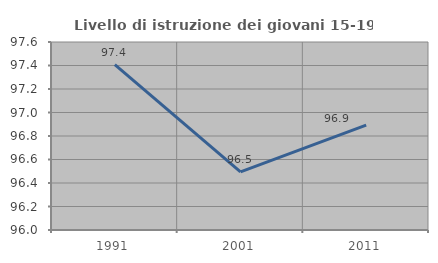
| Category | Livello di istruzione dei giovani 15-19 anni |
|---|---|
| 1991.0 | 97.408 |
| 2001.0 | 96.494 |
| 2011.0 | 96.893 |